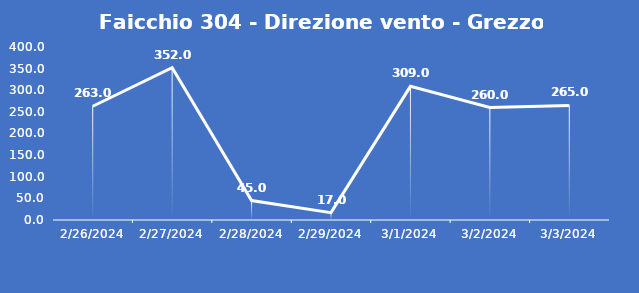
| Category | Faicchio 304 - Direzione vento - Grezzo (°N) |
|---|---|
| 2/26/24 | 263 |
| 2/27/24 | 352 |
| 2/28/24 | 45 |
| 2/29/24 | 17 |
| 3/1/24 | 309 |
| 3/2/24 | 260 |
| 3/3/24 | 265 |